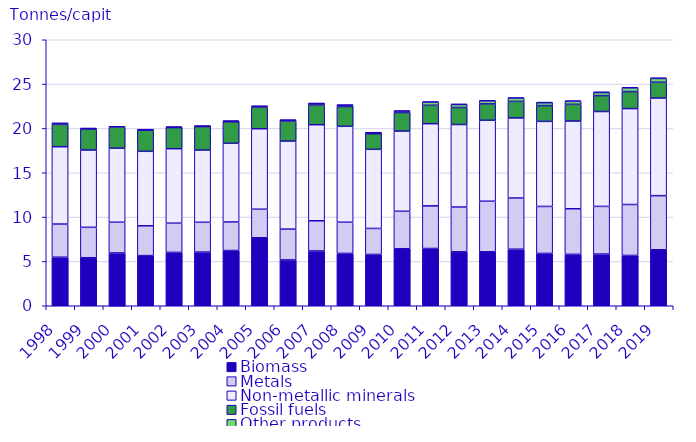
| Category | Biomass | Metals | Non-metallic minerals | Fossil fuels | Other products | Waste imported or exported |
|---|---|---|---|---|---|---|
| 1998.0 | 5.472 | 3.741 | 8.723 | 2.519 | 0.122 | 0 |
| 1999.0 | 5.418 | 3.428 | 8.719 | 2.34 | 0.088 | 0 |
| 2000.0 | 5.954 | 3.462 | 8.355 | 2.372 | 0.099 | 0 |
| 2001.0 | 5.654 | 3.365 | 8.401 | 2.374 | 0.062 | 0 |
| 2002.0 | 6.023 | 3.291 | 8.398 | 2.382 | 0.059 | 0 |
| 2003.0 | 6.054 | 3.362 | 8.144 | 2.651 | 0.053 | 0 |
| 2004.0 | 6.228 | 3.218 | 8.883 | 2.423 | 0.078 | 0 |
| 2005.0 | 7.669 | 3.218 | 9.077 | 2.418 | 0.122 | 0.002 |
| 2006.0 | 5.171 | 3.471 | 9.93 | 2.256 | 0.11 | 0.001 |
| 2007.0 | 6.18 | 3.406 | 10.832 | 2.219 | 0.177 | 0.001 |
| 2008.0 | 5.904 | 3.517 | 10.817 | 2.227 | 0.166 | 0.003 |
| 2009.0 | 5.787 | 2.934 | 8.921 | 1.764 | 0.11 | 0.017 |
| 2010.0 | 6.431 | 4.221 | 9.051 | 2.085 | 0.167 | 0.031 |
| 2011.0 | 6.458 | 4.806 | 9.27 | 2.071 | 0.357 | 0.049 |
| 2012.0 | 6.083 | 5.049 | 9.31 | 1.912 | 0.341 | 0.056 |
| 2013.0 | 6.087 | 5.704 | 9.13 | 1.845 | 0.346 | 0.058 |
| 2014.0 | 6.379 | 5.773 | 9.03 | 1.866 | 0.36 | 0.068 |
| 2015.0 | 5.904 | 5.296 | 9.593 | 1.781 | 0.324 | 0.068 |
| 2016.0 | 5.8 | 5.14 | 9.893 | 1.887 | 0.338 | 0.071 |
| 2017.0 | 5.829 | 5.376 | 10.702 | 1.793 | 0.347 | 0.075 |
| 2018.0 | 5.673 | 5.747 | 10.816 | 1.92 | 0.418 | 0.072 |
| 2019.0 | 6.309 | 6.109 | 11.012 | 1.784 | 0.422 | 0.075 |